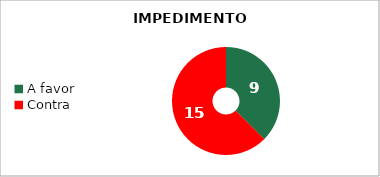
| Category | Series 1 |
|---|---|
| A favor | 9 |
| Contra | 15 |